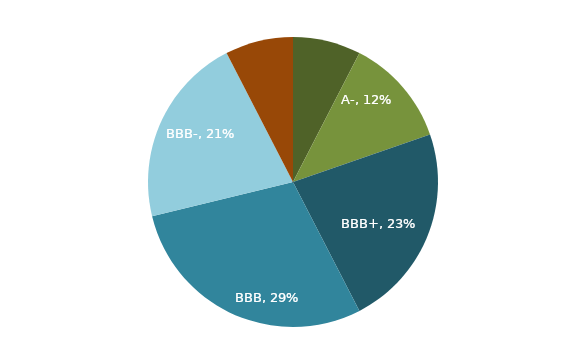
| Category | Series 0 |
|---|---|
| A or higher | 0.076 |
| A- | 0.121 |
| BBB+ | 0.227 |
| BBB | 0.288 |
| BBB- | 0.212 |
| Below BBB- | 0.076 |